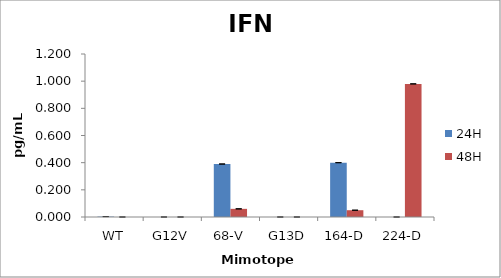
| Category | 24H | 48H |
|---|---|---|
| WT | 0.003 | 0 |
| G12V | 0 | 0 |
| 68-V | 0.39 | 0.06 |
| G13D | 0 | 0 |
| 164-D | 0.4 | 0.05 |
| 224-D | 0 | 0.98 |